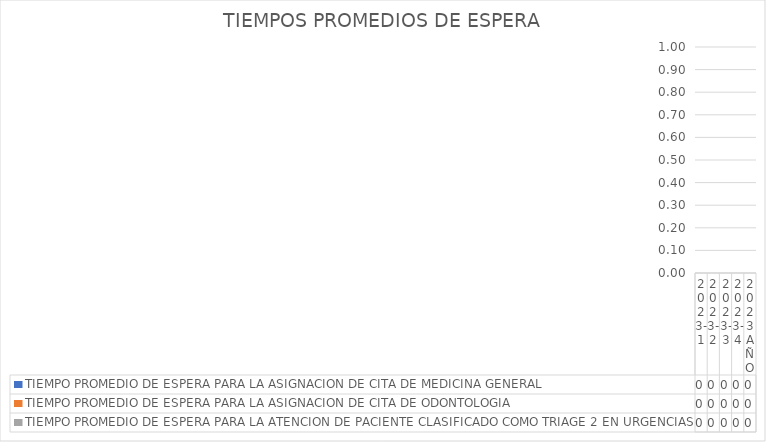
| Category | TIEMPO PROMEDIO DE ESPERA PARA LA ASIGNACION DE CITA DE MEDICINA GENERAL  | TIEMPO PROMEDIO DE ESPERA PARA LA ASIGNACION DE CITA DE ODONTOLOGIA  | TIEMPO PROMEDIO DE ESPERA PARA LA ATENCION DE PACIENTE CLASIFICADO COMO TRIAGE 2 EN URGENCIAS |
|---|---|---|---|
| 2023-1 | 0 | 0 | 0 |
| 2023-2 | 0 | 0 | 0 |
| 2023-3 | 0 | 0 | 0 |
| 2023-4 | 0 | 0 | 0 |
| 2023 AÑO | 0 | 0 | 0 |